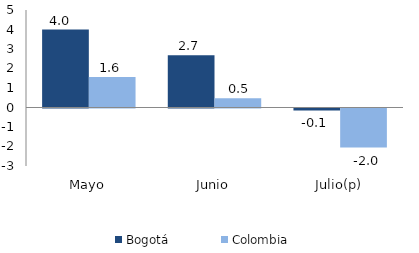
| Category | Bogotá | Colombia |
|---|---|---|
| Mayo | 3.996 | 1.559 |
| Junio | 2.68 | 0.479 |
| Julio(p) | -0.098 | -2 |